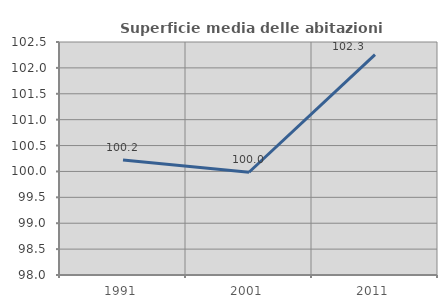
| Category | Superficie media delle abitazioni occupate |
|---|---|
| 1991.0 | 100.221 |
| 2001.0 | 99.984 |
| 2011.0 | 102.258 |